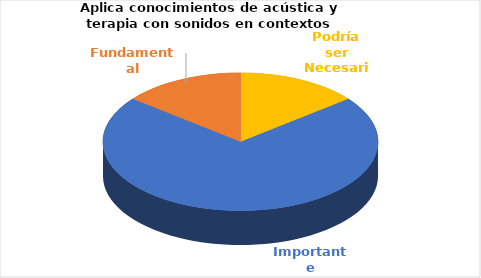
| Category | Series 0 |
|---|---|
| Podría ser Necesaria | 2 |
| Importante | 10 |
| Fundamental | 2 |